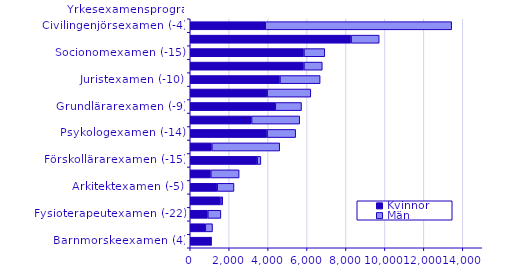
| Category | Kvinnor | Män |
|---|---|---|
| Barnmorskeexamen (4) | 1079 | 7 |
| Tandläkarexamen (9) | 775 | 370 |
| Fysioterapeutexamen (-22) | 902 | 671 |
| Specialpedagogexamen (-2) | 1573 | 96 |
| Arkitektexamen (-5) | 1384 | 862 |
| Civilekonomexamen (-15) | 1056 | 1456 |
| Förskollärarexamen (-15) | 3439 | 189 |
| Högskoleingenjörsexamen (-7) | 1110 | 3486 |
| Psykologexamen (-14) | 3948 | 1468 |
| Ämneslärarexamen (-11) | 3152 | 2471 |
| Grundlärarexamen (-9) | 4369 | 1347 |
| Läkarexamen (-6) | 3953 | 2240 |
| Juristexamen (-10) | 4608 | 2064 |
| Specialistsjuksköterskeexamen (-1) | 5839 | 944 |
| Socionomexamen (-15) | 5841 | 1070 |
| Sjuksköterskeexamen (-6) | 8263 | 1444 |
| Civilingenjörsexamen (-4) | 3853 | 9579 |